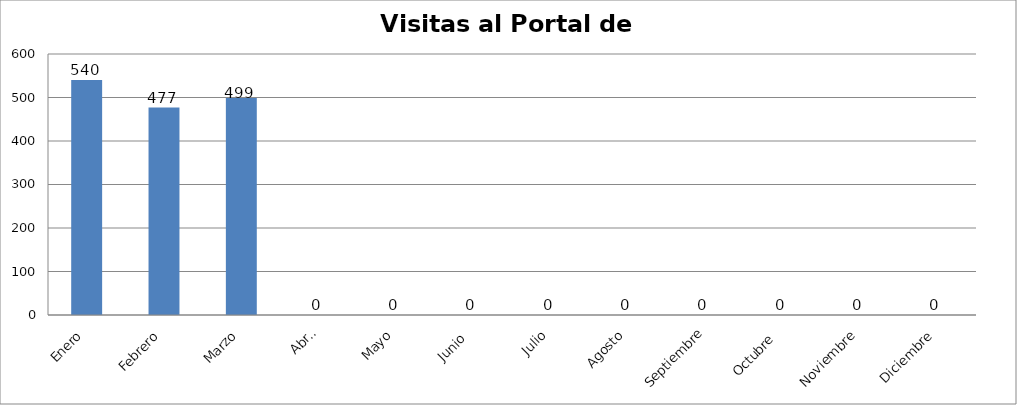
| Category | Series 0 |
|---|---|
| Enero | 540 |
| Febrero | 477 |
| Marzo | 499 |
| Abril | 0 |
| Mayo | 0 |
| Junio  | 0 |
| Julio | 0 |
| Agosto | 0 |
| Septiembre | 0 |
| Octubre  | 0 |
| Noviembre | 0 |
| Diciembre | 0 |